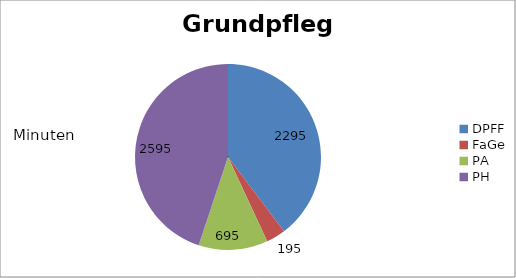
| Category | Grundpflege |
|---|---|
| DPFF | 2295 |
| FaGe | 195 |
| PA | 695 |
| PH | 2595 |